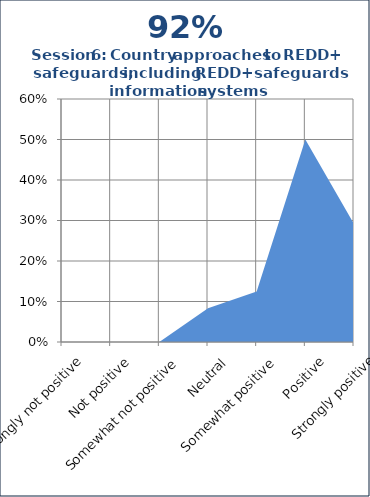
| Category | Series 1 |
|---|---|
| Strongly not positive | 0 |
| Not positive | 0 |
| Somewhat not positive | 0 |
| Neutral | 0.083 |
| Somewhat positive | 0.125 |
| Positive | 0.5 |
| Strongly positive | 0.292 |